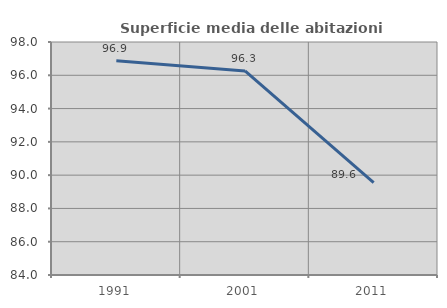
| Category | Superficie media delle abitazioni occupate |
|---|---|
| 1991.0 | 96.868 |
| 2001.0 | 96.264 |
| 2011.0 | 89.557 |